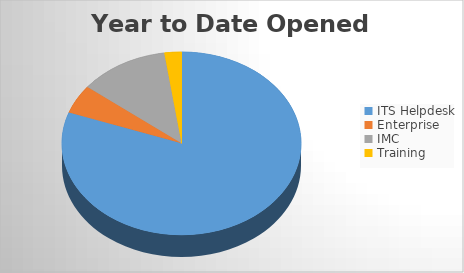
| Category | YTD Opened Tickets | 6M Opened |
|---|---|---|
| ITS Helpdesk | 1496 | 1496 |
| Enterprise | 95 | 95 |
| IMC | 225 | 225 |
| Training | 43 | 43 |